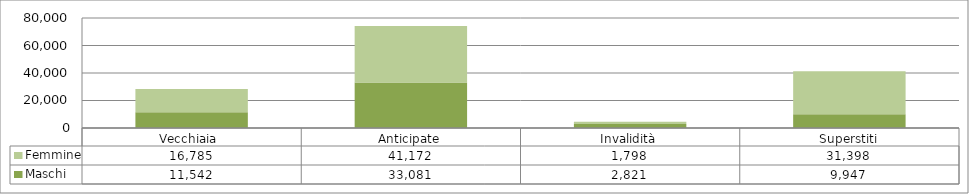
| Category | Maschi | Femmine |
|---|---|---|
| Vecchiaia  | 11542 | 16785 |
| Anticipate | 33081 | 41172 |
| Invalidità | 2821 | 1798 |
| Superstiti | 9947 | 31398 |